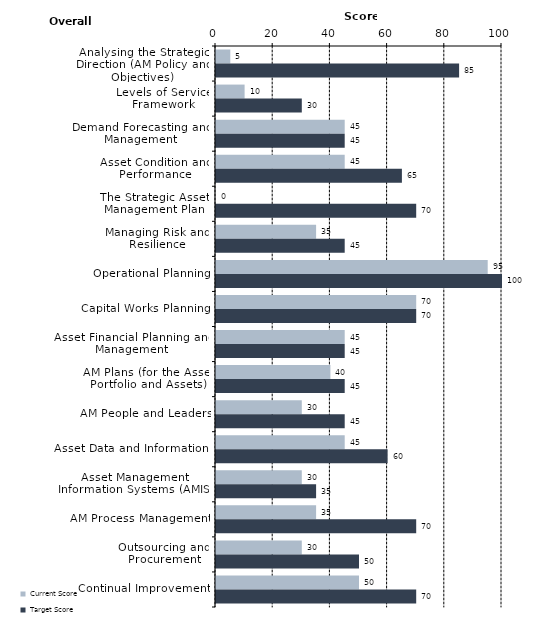
| Category | Current Score | Target Score |
|---|---|---|
| Analysing the Strategic Direction (AM Policy and Objectives)
 | 5 | 85 |
| Levels of Service Framework
 | 10 | 30 |
| Demand Forecasting and Management | 45 | 45 |
| Asset Condition and Performance | 45 | 65 |
| The Strategic Asset Management Plan
 | 0 | 70 |
| Managing Risk and Resilience | 35 | 45 |
| Operational Planning | 95 | 100 |
| Capital Works Planning | 70 | 70 |
| Asset Financial Planning and Management | 45 | 45 |
| AM Plans (for the Asset Portfolio and Assets) | 40 | 45 |
| AM People and Leaders | 30 | 45 |
| Asset Data and Information  | 45 | 60 |
| Asset Management Information Systems (AMIS) | 30 | 35 |
| AM Process Management | 35 | 70 |
| Outsourcing and Procurement | 30 | 50 |
| Continual Improvement | 50 | 70 |